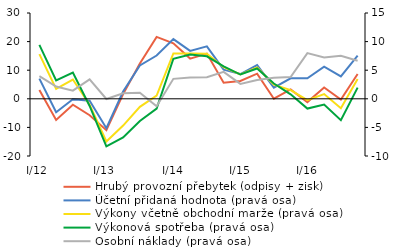
| Category | Hrubý provozní přebytek (odpisy + zisk)   |
|---|---|
| I/12 | 3.048 |
| II | -7.377 |
| III | -2.049 |
| IV | -5.737 |
| I/13 | -10.985 |
| II | 1.651 |
| III | 12.354 |
| IV | 21.633 |
|  I/14 | 19.377 |
| II | 14.056 |
| III | 15.807 |
| IV | 5.608 |
|  I/15 | 6.258 |
|  II | 8.779 |
| III | 0.02 |
| IV | 3.287 |
|  I/16 | -1.156 |
| II | 3.931 |
| III | -0.244 |
| IV | 8.649 |